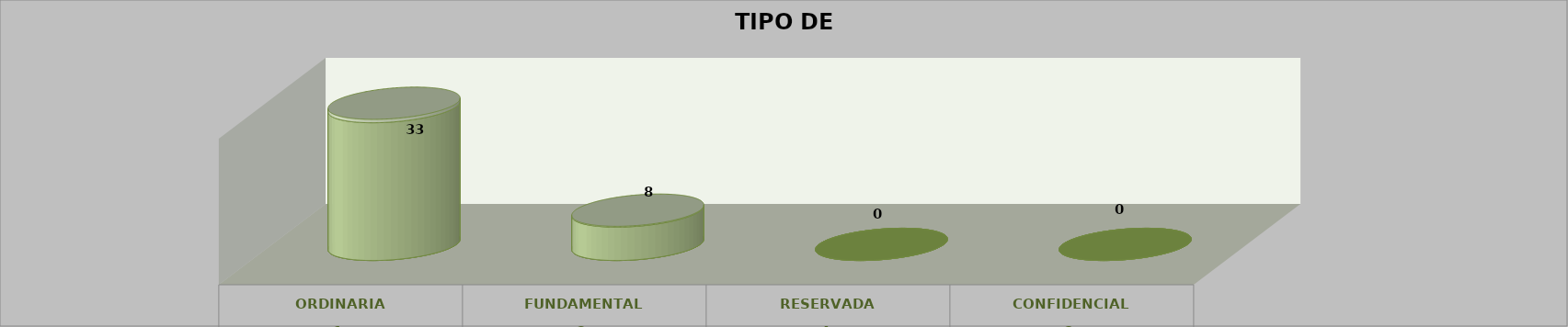
| Category | Series 0 | Series 2 | Series 1 | Series 3 | Series 4 |
|---|---|---|---|---|---|
| 0 |  |  |  | 33 | 0.805 |
| 1 |  |  |  | 8 | 0.195 |
| 2 |  |  |  | 0 | 0 |
| 3 |  |  |  | 0 | 0 |